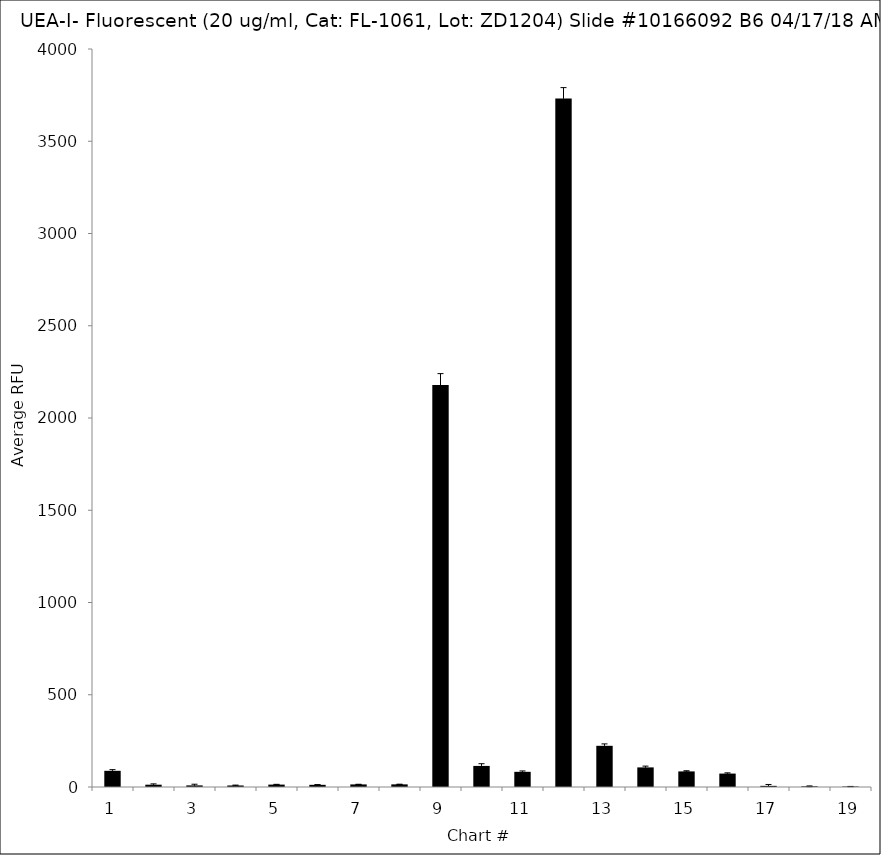
| Category | Series 0 |
|---|---|
| 1.0 | 87.75 |
| 2.0 | 12.5 |
| 3.0 | 8.75 |
| 4.0 | 8.25 |
| 5.0 | 13 |
| 6.0 | 11.75 |
| 7.0 | 14 |
| 8.0 | 14.25 |
| 9.0 | 2178.75 |
| 10.0 | 114.25 |
| 11.0 | 82.25 |
| 12.0 | 3731.75 |
| 13.0 | 223.25 |
| 14.0 | 106.25 |
| 15.0 | 84.5 |
| 16.0 | 72.75 |
| 17.0 | 6.25 |
| 18.0 | 3.75 |
| 19.0 | 2.5 |